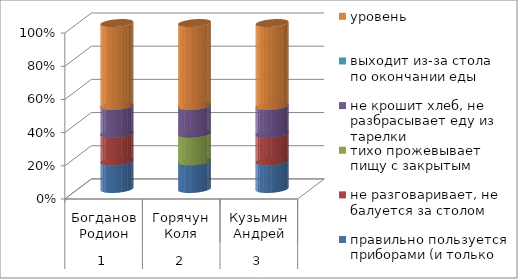
| Category | правильно пользуется приборами (и только | не разговаривает, не балуется за столом | тихо прожевывает пищу с закрытым | не крошит хлеб, не разбрасывает еду из тарелки | выходит из-за стола по окончании еды | уровень |
|---|---|---|---|---|---|---|
| 0 | 1 | 1 | 0 | 1 | 0 | 3 |
| 1 | 1 | 0 | 1 | 1 | 0 | 3 |
| 2 | 1 | 1 | 0 | 1 | 0 | 3 |